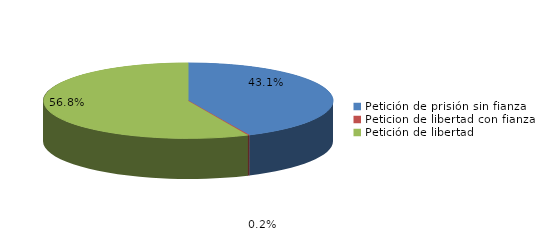
| Category | Series 0 |
|---|---|
| Petición de prisión sin fianza | 236 |
| Peticion de libertad con fianza | 1 |
| Petición de libertad | 311 |